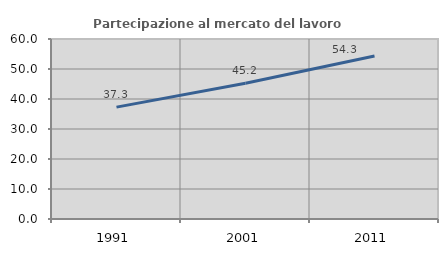
| Category | Partecipazione al mercato del lavoro  femminile |
|---|---|
| 1991.0 | 37.29 |
| 2001.0 | 45.225 |
| 2011.0 | 54.333 |